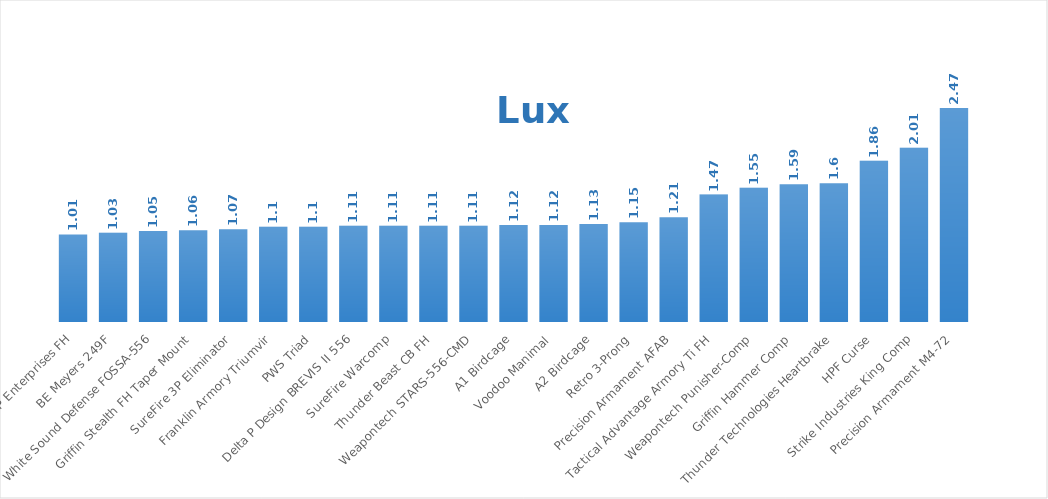
| Category | Series 0 |
|---|---|
| JP Enterprises FH | 1.01 |
| BE Meyers 249F | 1.03 |
| White Sound Defense FOSSA-556 | 1.05 |
| Griffin Stealth FH Taper Mount | 1.06 |
| SureFire 3P Eliminator | 1.07 |
| Franklin Armory Triumvir | 1.1 |
| PWS Triad | 1.1 |
| Delta P Design BREVIS II 556 | 1.11 |
| SureFire Warcomp | 1.11 |
| Thunder Beast CB FH | 1.11 |
| Weapontech STARS-556-CMD | 1.11 |
| A1 Birdcage | 1.12 |
| Voodoo Manimal | 1.12 |
| A2 Birdcage | 1.13 |
| Retro 3-Prong | 1.15 |
| Precision Armament AFAB | 1.21 |
| Tactical Advantage Armory Ti FH | 1.47 |
| Weapontech Punisher-Comp | 1.55 |
| Griffin Hammer Comp | 1.59 |
| Thunder Technologies Heartbrake | 1.6 |
| HPF Curse | 1.86 |
| Strike Industries King Comp | 2.01 |
| Precision Armament M4-72 | 2.47 |